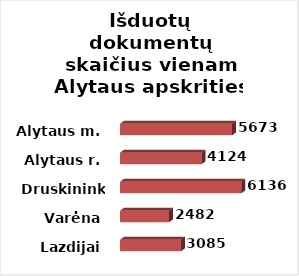
| Category | Series 0 |
|---|---|
| Lazdijai | 3085 |
| Varėna | 2482 |
| Druskininkai | 6136 |
| Alytaus r. | 4124 |
| Alytaus m. | 5673 |